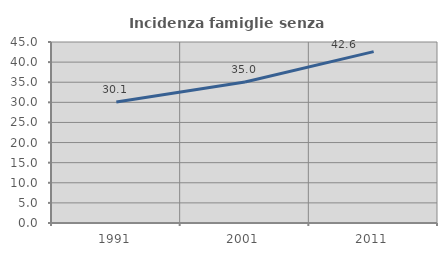
| Category | Incidenza famiglie senza nuclei |
|---|---|
| 1991.0 | 30.091 |
| 2001.0 | 35.04 |
| 2011.0 | 42.611 |